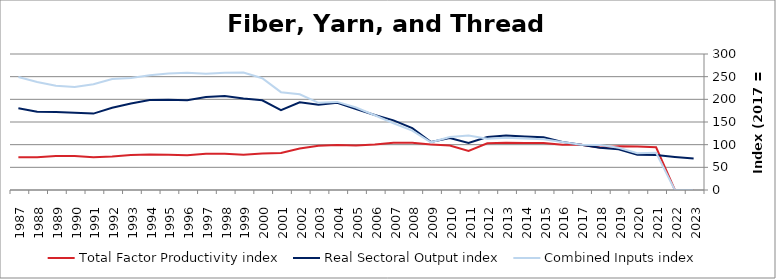
| Category | Total Factor Productivity index | Real Sectoral Output index | Combined Inputs index |
|---|---|---|---|
| 2023.0 | 0 | 69.476 | 0 |
| 2022.0 | 0 | 72.996 | 0 |
| 2021.0 | 94.169 | 77.409 | 82.202 |
| 2020.0 | 95.72 | 77.768 | 81.246 |
| 2019.0 | 96.348 | 89.721 | 93.122 |
| 2018.0 | 94.005 | 93.245 | 99.192 |
| 2017.0 | 100 | 100 | 100 |
| 2016.0 | 100.083 | 106.159 | 106.071 |
| 2015.0 | 103.683 | 116.162 | 112.036 |
| 2014.0 | 103.922 | 117.979 | 113.527 |
| 2013.0 | 104.297 | 120.259 | 115.304 |
| 2012.0 | 103.227 | 116.751 | 113.101 |
| 2011.0 | 86.314 | 103.961 | 120.445 |
| 2010.0 | 97.968 | 114.443 | 116.817 |
| 2009.0 | 100.555 | 105.79 | 105.206 |
| 2008.0 | 104.023 | 136.439 | 131.162 |
| 2007.0 | 104.257 | 153.516 | 147.248 |
| 2006.0 | 100.225 | 165.325 | 164.954 |
| 2005.0 | 98.249 | 178.72 | 181.905 |
| 2004.0 | 99.024 | 192.405 | 194.302 |
| 2003.0 | 97.801 | 188.12 | 192.351 |
| 2002.0 | 91.487 | 193.286 | 211.272 |
| 2001.0 | 81.641 | 176.176 | 215.792 |
| 2000.0 | 80.244 | 197.793 | 246.489 |
| 1999.0 | 77.96 | 201.899 | 258.977 |
| 1998.0 | 80.088 | 207.261 | 258.793 |
| 1997.0 | 80.038 | 205.079 | 256.228 |
| 1996.0 | 76.495 | 197.936 | 258.756 |
| 1995.0 | 77.638 | 199.342 | 256.759 |
| 1994.0 | 78.34 | 198.471 | 253.347 |
| 1993.0 | 77.313 | 191.007 | 247.055 |
| 1992.0 | 74.141 | 181.486 | 244.786 |
| 1991.0 | 72.186 | 168.531 | 233.469 |
| 1990.0 | 74.91 | 170.168 | 227.164 |
| 1989.0 | 74.755 | 171.828 | 229.855 |
| 1988.0 | 72.459 | 172.596 | 238.198 |
| 1987.0 | 72.347 | 180.409 | 249.365 |